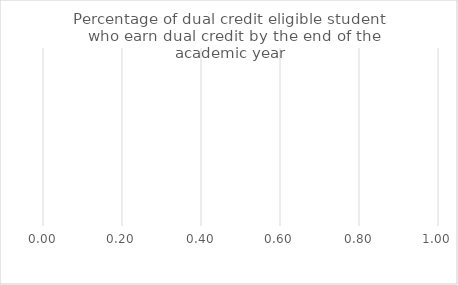
| Category | Benchmark | Entire LEA  | Title IV-A Identified Schools |
|---|---|---|---|
| Percentage of dual credit eligible students who earn dual credit by the end of the academic year | 0 | 0 | 0 |